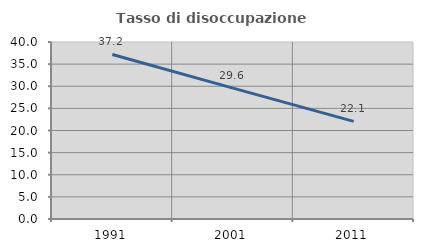
| Category | Tasso di disoccupazione giovanile  |
|---|---|
| 1991.0 | 37.19 |
| 2001.0 | 29.577 |
| 2011.0 | 22.059 |